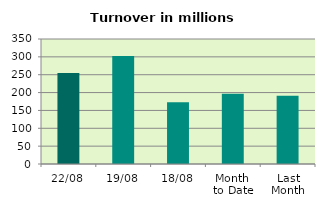
| Category | Series 0 |
|---|---|
| 22/08 | 254.701 |
| 19/08 | 302.639 |
| 18/08 | 173.161 |
| Month 
to Date | 196.924 |
| Last
Month | 191.038 |